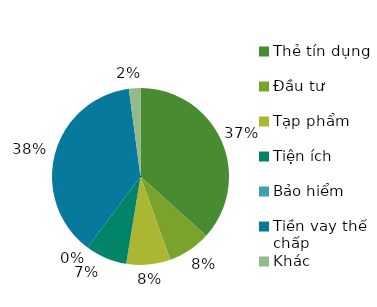
| Category | Tổng cộng |
|---|---|
| Thẻ tín dụng | 936.48 |
| Đầu tư | 200 |
| Tạp phẩm | 205.61 |
| Tiện ích | 194.2 |
| Bảo hiểm | 0 |
| Tiền vay thế chấp | 961.77 |
| Khác | 53.65 |